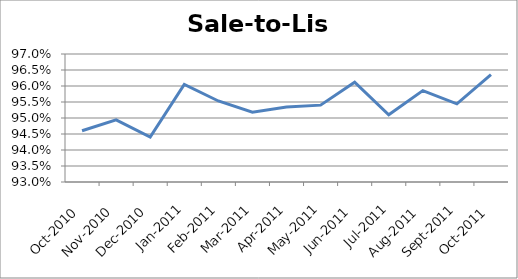
| Category | Series 0 |
|---|---|
| 2010-10-01 | 0.946 |
| 2010-11-01 | 0.949 |
| 2010-12-01 | 0.944 |
| 2011-01-01 | 0.961 |
| 2011-02-01 | 0.955 |
| 2011-03-01 | 0.952 |
| 2011-04-01 | 0.953 |
| 2011-05-01 | 0.954 |
| 2011-06-01 | 0.961 |
| 2011-07-01 | 0.951 |
| 2011-08-01 | 0.959 |
| 2011-09-01 | 0.954 |
| 2011-10-01 | 0.964 |